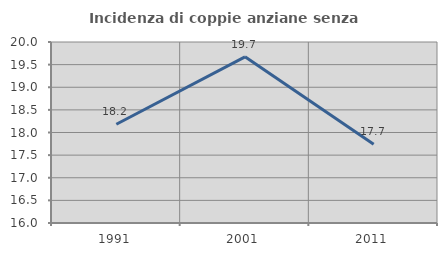
| Category | Incidenza di coppie anziane senza figli  |
|---|---|
| 1991.0 | 18.182 |
| 2001.0 | 19.672 |
| 2011.0 | 17.742 |